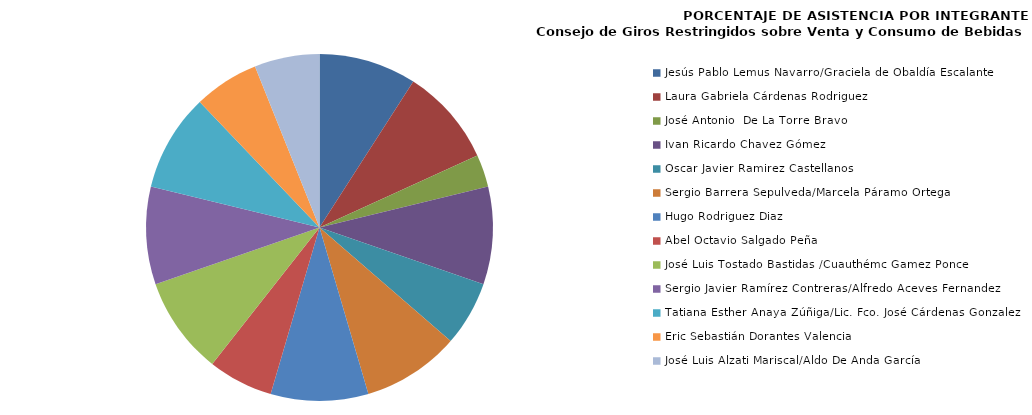
| Category | Series 0 |
|---|---|
| Jesús Pablo Lemus Navarro/Graciela de Obaldía Escalante | 100 |
| Laura Gabriela Cárdenas Rodriguez | 100 |
| José Antonio  De La Torre Bravo | 33.333 |
| Ivan Ricardo Chavez Gómez | 100 |
| Oscar Javier Ramirez Castellanos | 66.667 |
| Sergio Barrera Sepulveda/Marcela Páramo Ortega | 100 |
| Hugo Rodriguez Diaz | 100 |
| Abel Octavio Salgado Peña | 66.667 |
| José Luis Tostado Bastidas /Cuauthémc Gamez Ponce | 100 |
| Sergio Javier Ramírez Contreras/Alfredo Aceves Fernandez | 100 |
| Tatiana Esther Anaya Zúñiga/Lic. Fco. José Cárdenas Gonzalez | 100 |
| Eric Sebastián Dorantes Valencia | 66.667 |
| José Luis Alzati Mariscal/Aldo De Anda García | 66.667 |